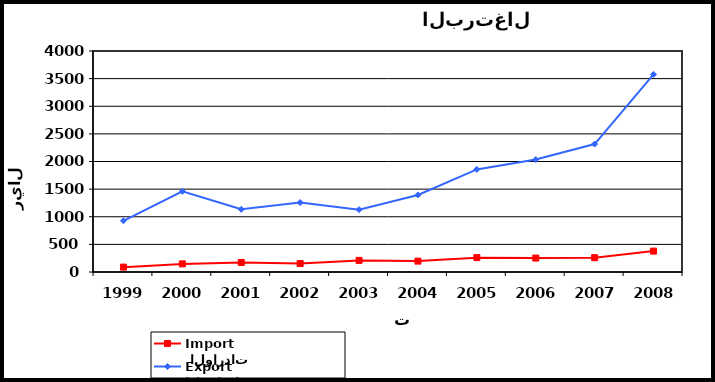
| Category |  الواردات           Import | الصادرات          Export |
|---|---|---|
| 1999.0 | 88 | 927 |
| 2000.0 | 147 | 1460 |
| 2001.0 | 173 | 1135 |
| 2002.0 | 153 | 1257 |
| 2003.0 | 210 | 1129 |
| 2004.0 | 197 | 1395 |
| 2005.0 | 260 | 1857 |
| 2006.0 | 252 | 2035 |
| 2007.0 | 259 | 2316 |
| 2008.0 | 378 | 3577 |